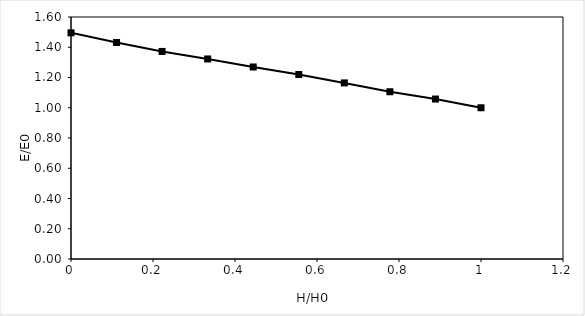
| Category | Head (feet) |
|---|---|
| 1.0 | 1 |
| 0.888888888888889 | 1.058 |
| 0.7777777777777779 | 1.106 |
| 0.6666666666666667 | 1.164 |
| 0.5555555555555557 | 1.22 |
| 0.44444444444444464 | 1.269 |
| 0.33333333333333354 | 1.323 |
| 0.22222222222222238 | 1.372 |
| 0.11111111111111119 | 1.432 |
| 0.0 | 1.495 |